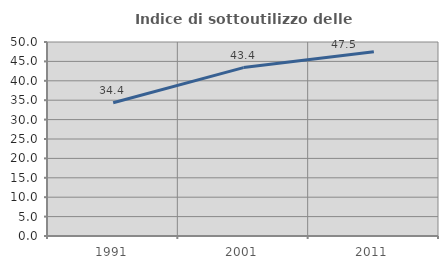
| Category | Indice di sottoutilizzo delle abitazioni  |
|---|---|
| 1991.0 | 34.355 |
| 2001.0 | 43.407 |
| 2011.0 | 47.469 |